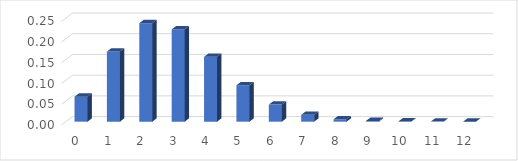
| Category | Series 0 |
|---|---|
| 0.0 | 0.06 |
| 1.0 | 0.169 |
| 2.0 | 0.238 |
| 3.0 | 0.223 |
| 4.0 | 0.156 |
| 5.0 | 0.088 |
| 6.0 | 0.041 |
| 7.0 | 0.017 |
| 8.0 | 0.006 |
| 9.0 | 0.002 |
| 10.0 | 0.001 |
| 11.0 | 0 |
| 12.0 | 0 |